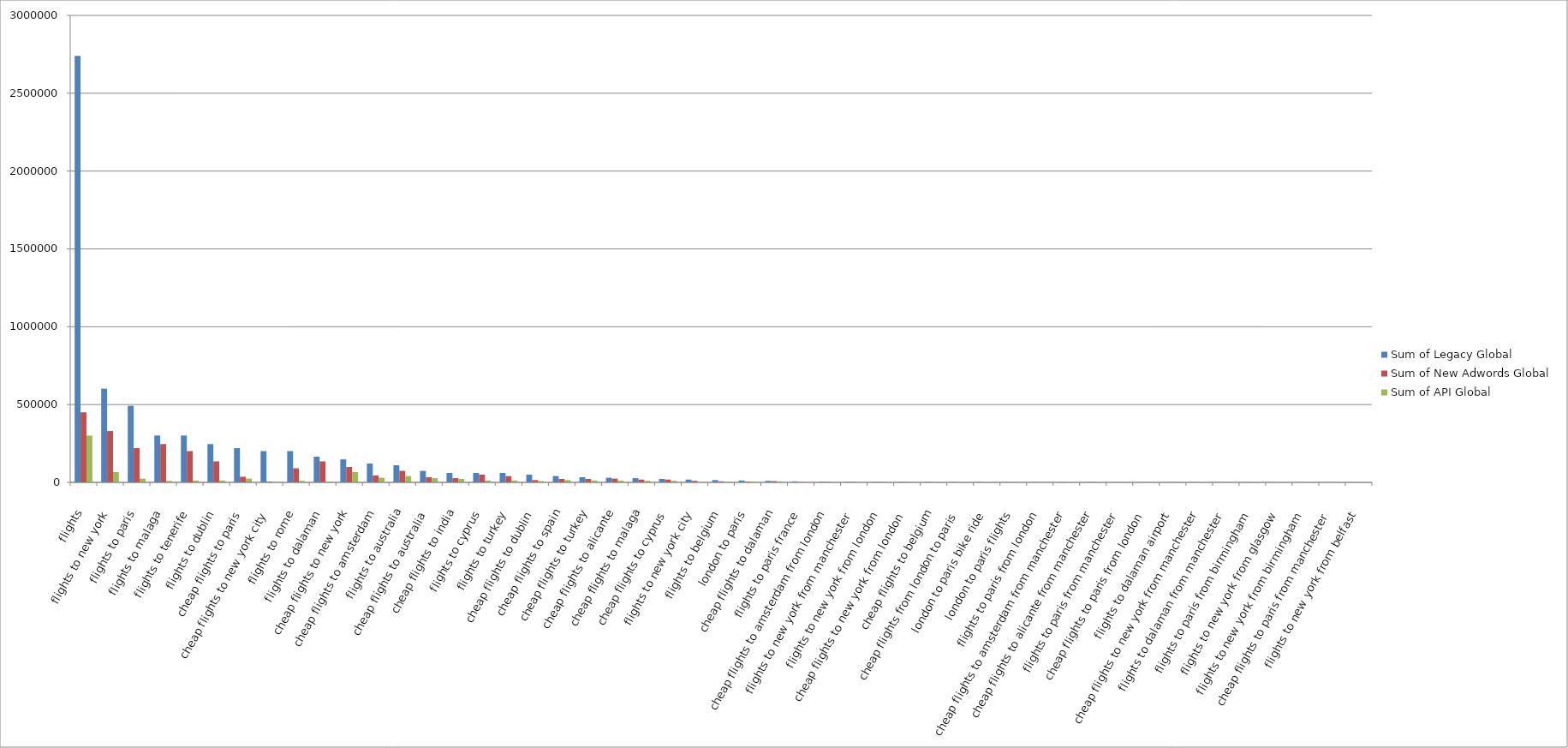
| Category | Sum of Legacy Global | Sum of New Adwords Global | Sum of API Global |
|---|---|---|---|
| flights | 2740000 | 450000 | 301000 |
| flights to new york | 602000 | 330000 | 66200 |
| flights to paris | 492000 | 220000 | 24200 |
| flights to malaga | 301000 | 246000 | 9900 |
| flights to tenerife | 301000 | 201000 | 12100 |
| flights to dublin | 246000 | 135000 | 12100 |
| cheap flights to paris | 220000 | 36200 | 24200 |
| cheap flights to new york city | 201000 | 5400 | 1600 |
| flights to rome | 201000 | 90500 | 9900 |
| flights to dalaman | 165000 | 135000 | 5400 |
| cheap flights to new york | 148000 | 99000 | 66200 |
| cheap flights to amsterdam | 121000 | 44400 | 29600 |
| flights to australia | 110000 | 74000 | 40500 |
| cheap flights to australia | 74000 | 33100 | 27100 |
| cheap flights to india | 60500 | 27100 | 22200 |
| flights to cyprus | 60500 | 49500 | 12100 |
| flights to turkey | 60500 | 40500 | 12100 |
| cheap flights to dublin | 49500 | 14800 | 8100 |
| cheap flights to spain | 40500 | 22200 | 14800 |
| cheap flights to turkey | 33100 | 22200 | 12100 |
| cheap flights to alicante | 29600 | 24200 | 10800 |
| cheap flights to malaga | 27100 | 18100 | 9900 |
| cheap flights to cyprus | 22200 | 18100 | 9900 |
| flights to new york city | 18100 | 9900 | 1900 |
| flights to belgium | 14800 | 6600 | 1300 |
| london to paris | 12100 | 5400 | 5400 |
| cheap flights to dalaman | 9900 | 8100 | 4400 |
| flights to paris france | 6600 | 1600 | 1000 |
| cheap flights to amsterdam from london | 3800 | 3200 | 2000 |
| flights to new york from manchester | 2900 | 2400 | 1300 |
| flights to new york from london | 2900 | 2400 | 1000 |
| cheap flights to new york from london | 2400 | 1900 | 1300 |
| cheap flights to belgium | 2400 | 720 | 720 |
| cheap flights from london to paris | 2000 | 0 | 1180 |
| london to paris bike ride | 1900 | 0 | 1000 |
| london to paris flights | 1600 | 880 | 720 |
| flights to paris from london | 1600 | 1000 | 720 |
| cheap flights to amsterdam from manchester | 1440 | 0 | 640 |
| cheap flights to alicante from manchester | 1440 | 1440 | 520 |
| flights to paris from manchester | 1300 | 1300 | 720 |
| cheap flights to paris from london | 1300 | 1000 | 720 |
| flights to dalaman airport | 1300 | 1300 | 390 |
| cheap flights to new york from manchester | 1000 | 0 | 590 |
| flights to dalaman from manchester | 1000 | 880 | 210 |
| flights to paris from birmingham | 880 | 0 | 390 |
| flights to new york from glasgow | 880 | 720 | 390 |
| flights to new york from birmingham | 880 | 720 | 390 |
| cheap flights to paris from manchester | 720 | 720 | 390 |
| flights to new york from belfast | 590 | 0 | 260 |